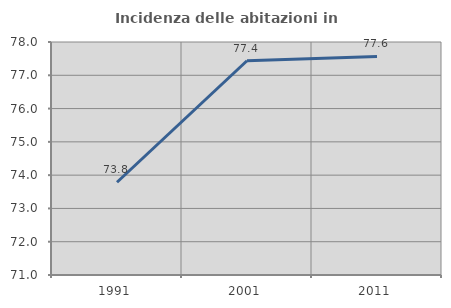
| Category | Incidenza delle abitazioni in proprietà  |
|---|---|
| 1991.0 | 73.786 |
| 2001.0 | 77.436 |
| 2011.0 | 77.567 |